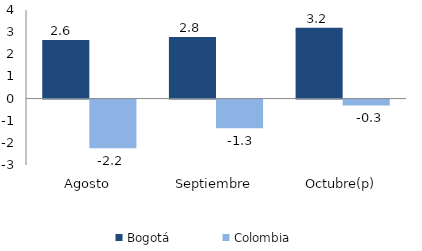
| Category | Bogotá | Colombia |
|---|---|---|
| Agosto | 2.647 | -2.2 |
| Septiembre | 2.781 | -1.299 |
| Octubre(p) | 3.195 | -0.266 |